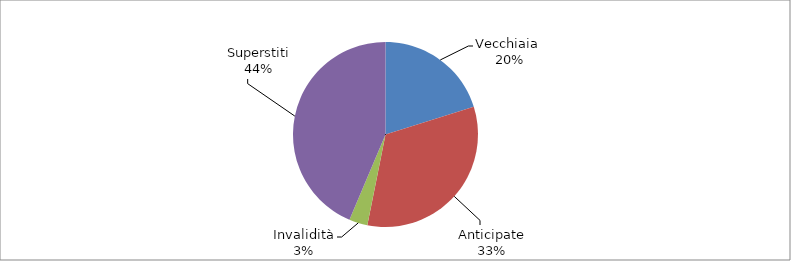
| Category | Series 0 |
|---|---|
| Vecchiaia  | 2281 |
| Anticipate | 3730 |
| Invalidità | 364 |
| Superstiti | 4934 |